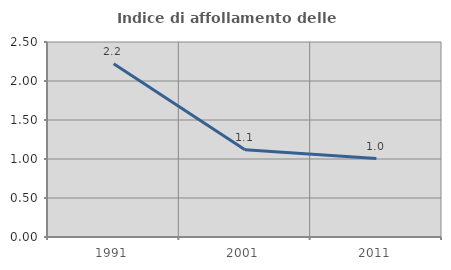
| Category | Indice di affollamento delle abitazioni  |
|---|---|
| 1991.0 | 2.222 |
| 2001.0 | 1.117 |
| 2011.0 | 1.005 |